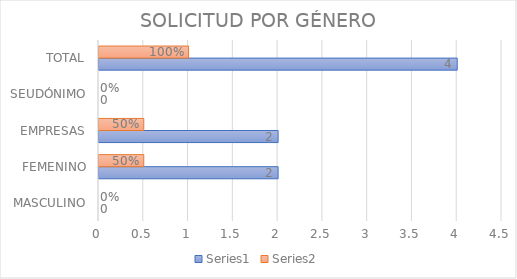
| Category | Series 0 | Series 1 |
|---|---|---|
| MASCULINO | 0 | 0 |
| FEMENINO | 2 | 0.5 |
| EMPRESAS | 2 | 0.5 |
| SEUDÓNIMO | 0 | 0 |
| TOTAL | 4 | 1 |